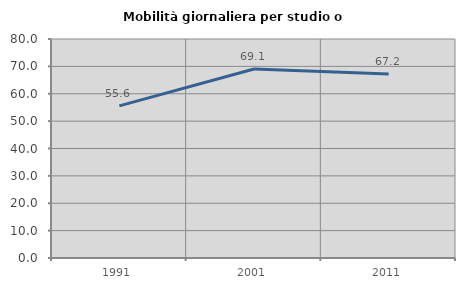
| Category | Mobilità giornaliera per studio o lavoro |
|---|---|
| 1991.0 | 55.569 |
| 2001.0 | 69.056 |
| 2011.0 | 67.201 |